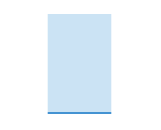
| Category | Series 0 | Series 1 |
|---|---|---|
| 0 | 13680.81 | 634319.19 |